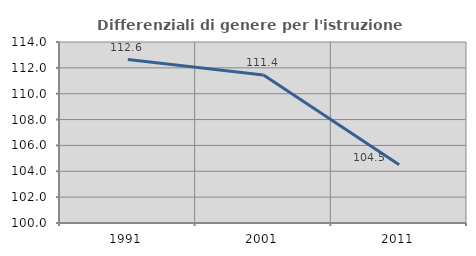
| Category | Differenziali di genere per l'istruzione superiore |
|---|---|
| 1991.0 | 112.641 |
| 2001.0 | 111.441 |
| 2011.0 | 104.509 |